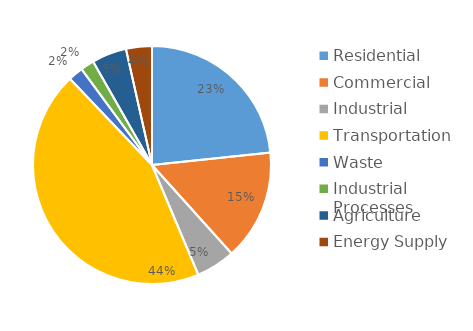
| Category | MTCO2e* |
|---|---|
| Residential | 1450060.216 |
| Commercial | 933483.91 |
| Industrial | 329636.938 |
| Transportation | 2751301.132 |
| Waste | 125764.077 |
| Industrial Processes | 114512.566 |
| Agriculture | 293729.105 |
| Energy Supply | 218615.266 |